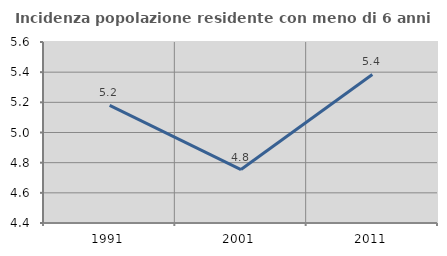
| Category | Incidenza popolazione residente con meno di 6 anni |
|---|---|
| 1991.0 | 5.18 |
| 2001.0 | 4.754 |
| 2011.0 | 5.385 |